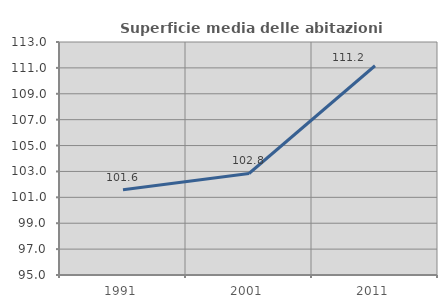
| Category | Superficie media delle abitazioni occupate |
|---|---|
| 1991.0 | 101.588 |
| 2001.0 | 102.842 |
| 2011.0 | 111.166 |